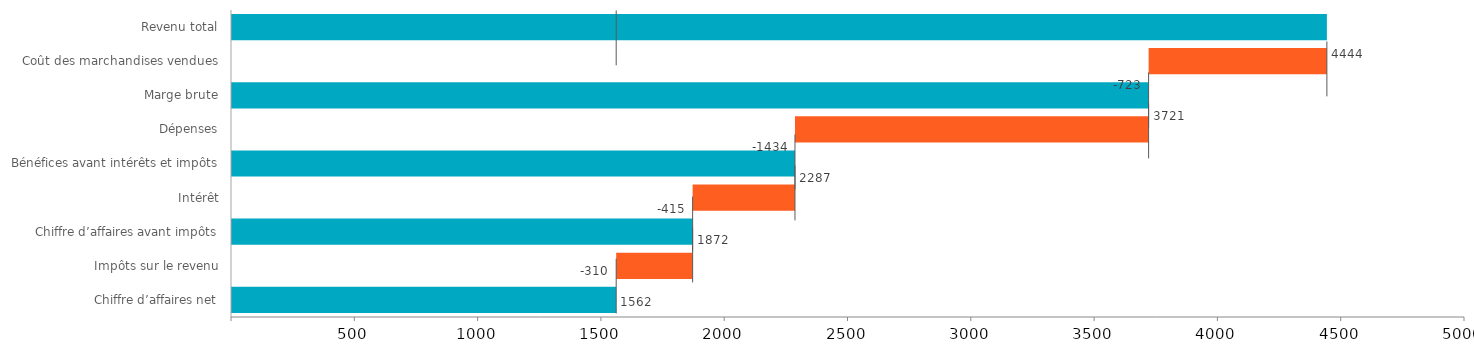
| Category | Se termine le | Vide | NegLoss | NegGain | PosLoss | PosGain |
|---|---|---|---|---|---|---|
| Revenu total | 4444 | 0 | 0 | 0 | 0 | 0 |
| Coût des marchandises vendues | 0 | 3721 | 0 | 0 | 723 | 0 |
| Marge brute | 3721 | 0 | 0 | 0 | 0 | 0 |
| Dépenses | 0 | 2287 | 0 | 0 | 1434 | 0 |
| Bénéfices avant intérêts et impôts | 2287 | 0 | 0 | 0 | 0 | 0 |
| Intérêt | 0 | 1872 | 0 | 0 | 415 | 0 |
| Chiffre d’affaires avant impôts | 1872 | 0 | 0 | 0 | 0 | 0 |
| Impôts sur le revenu | 0 | 1562 | 0 | 0 | 310 | 0 |
| Chiffre d’affaires net | 1562 | 0 | 0 | 0 | 0 | 0 |